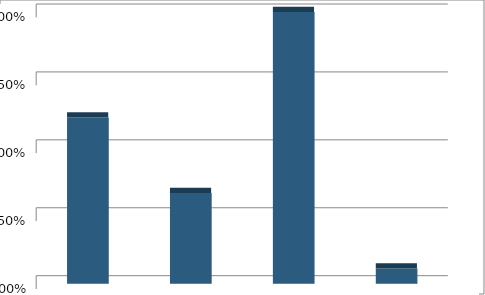
| Category | Series1 |
|---|---|
| Alternative Future #1: Low Intensity | 0.306 |
| Alternative Future #2: Medium Intensity | 0.167 |
| Alternative Future #3: High Intensity | 0.5 |
| None of the Above | 0.028 |